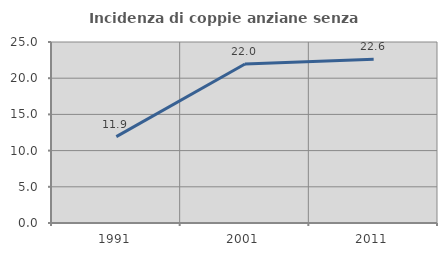
| Category | Incidenza di coppie anziane senza figli  |
|---|---|
| 1991.0 | 11.929 |
| 2001.0 | 21.958 |
| 2011.0 | 22.601 |